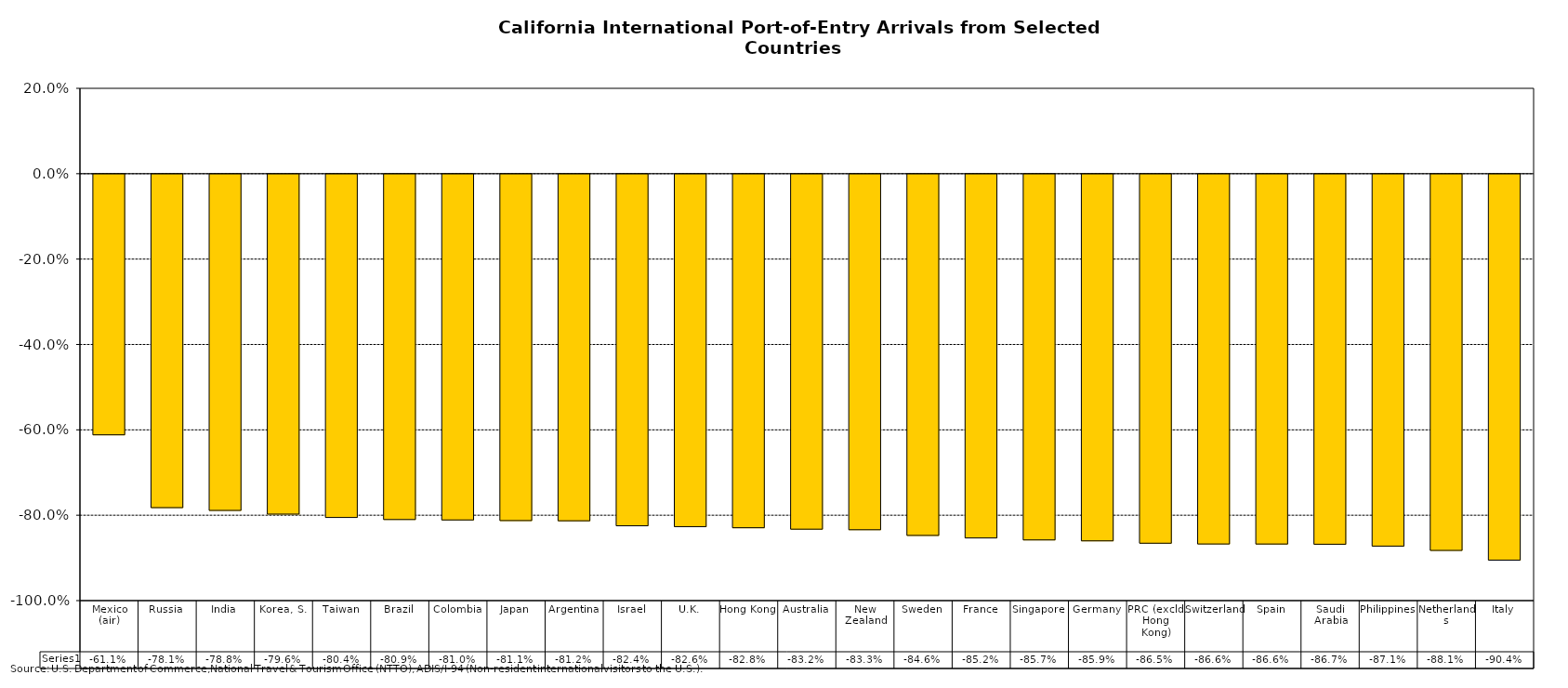
| Category | Series 0 |
|---|---|
| Mexico (air) | -0.611 |
| Russia | -0.781 |
| India | -0.788 |
| Korea, S. | -0.796 |
| Taiwan | -0.804 |
| Brazil | -0.809 |
| Colombia | -0.81 |
| Japan | -0.811 |
| Argentina | -0.812 |
| Israel | -0.824 |
| U.K. | -0.826 |
| Hong Kong | -0.828 |
| Australia | -0.832 |
| New Zealand | -0.833 |
| Sweden | -0.846 |
| France | -0.852 |
| Singapore | -0.857 |
| Germany | -0.859 |
| PRC (excld. Hong Kong) | -0.865 |
| Switzerland | -0.866 |
| Spain | -0.866 |
| Saudi Arabia | -0.867 |
| Philippines | -0.871 |
| Netherlands | -0.881 |
| Italy | -0.904 |